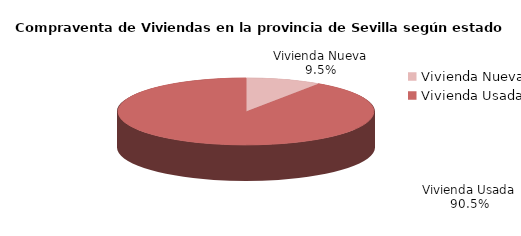
| Category | Series 0 | Series 1 |
|---|---|---|
| Vivienda Nueva | 142 | 0.095 |
| Vivienda Usada | 1354 | 0.905 |